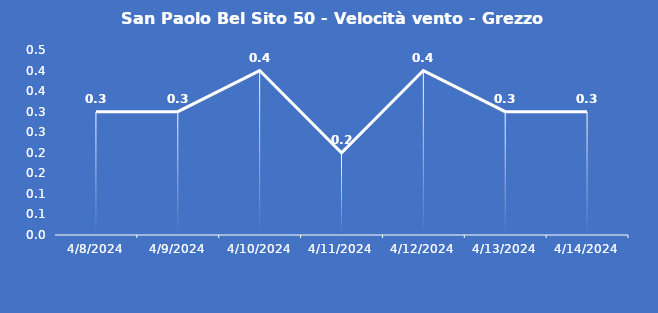
| Category | San Paolo Bel Sito 50 - Velocità vento - Grezzo (m/s) |
|---|---|
| 4/8/24 | 0.3 |
| 4/9/24 | 0.3 |
| 4/10/24 | 0.4 |
| 4/11/24 | 0.2 |
| 4/12/24 | 0.4 |
| 4/13/24 | 0.3 |
| 4/14/24 | 0.3 |